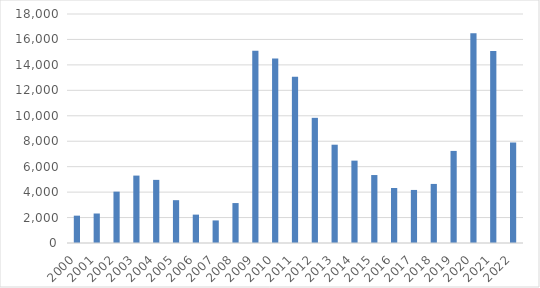
| Category | Series 0 |
|---|---|
| 2000.0 | 2149 |
| 2001.0 | 2319 |
| 2002.0 | 4037 |
| 2003.0 | 5299 |
| 2004.0 | 4962 |
| 2005.0 | 3366 |
| 2006.0 | 2231 |
| 2007.0 | 1774 |
| 2008.0 | 3139 |
| 2009.0 | 15121 |
| 2010.0 | 14503 |
| 2011.0 | 13066 |
| 2012.0 | 9838 |
| 2013.0 | 7726 |
| 2014.0 | 6474 |
| 2015.0 | 5342 |
| 2016.0 | 4324 |
| 2017.0 | 4171 |
| 2018.0 | 4643 |
| 2019.0 | 7238 |
| 2020.0 | 16496.333 |
| 2021.0 | 15082 |
| 2022.0 | 7899.833 |